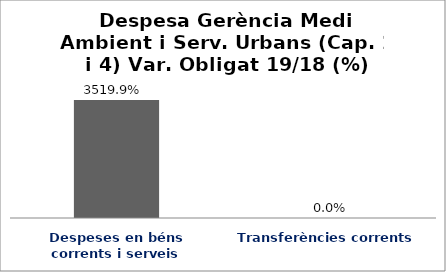
| Category | Series 0 |
|---|---|
| Despeses en béns corrents i serveis | 35.199 |
| Transferències corrents | 0 |